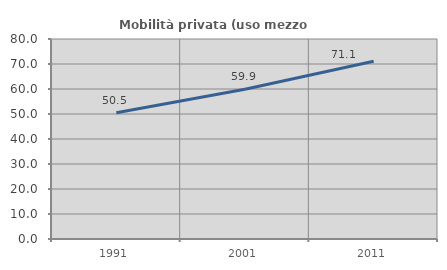
| Category | Mobilità privata (uso mezzo privato) |
|---|---|
| 1991.0 | 50.514 |
| 2001.0 | 59.926 |
| 2011.0 | 71.073 |